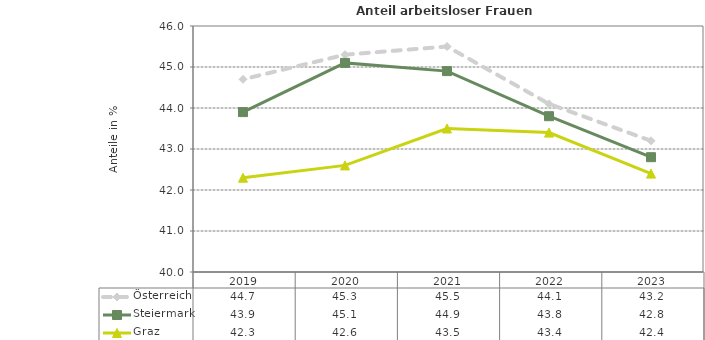
| Category | Österreich | Steiermark | Graz |
|---|---|---|---|
| 2023.0 | 43.2 | 42.8 | 42.4 |
| 2022.0 | 44.1 | 43.8 | 43.4 |
| 2021.0 | 45.5 | 44.9 | 43.5 |
| 2020.0 | 45.3 | 45.1 | 42.6 |
| 2019.0 | 44.7 | 43.9 | 42.3 |